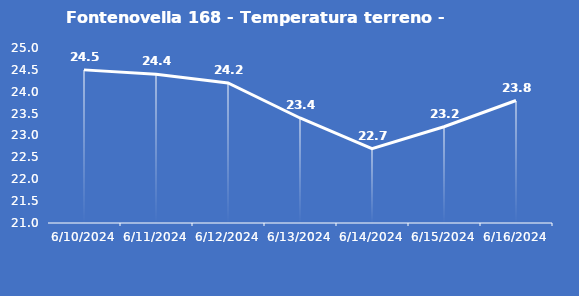
| Category | Fontenovella 168 - Temperatura terreno - Grezzo (°C) |
|---|---|
| 6/10/24 | 24.5 |
| 6/11/24 | 24.4 |
| 6/12/24 | 24.2 |
| 6/13/24 | 23.4 |
| 6/14/24 | 22.7 |
| 6/15/24 | 23.2 |
| 6/16/24 | 23.8 |